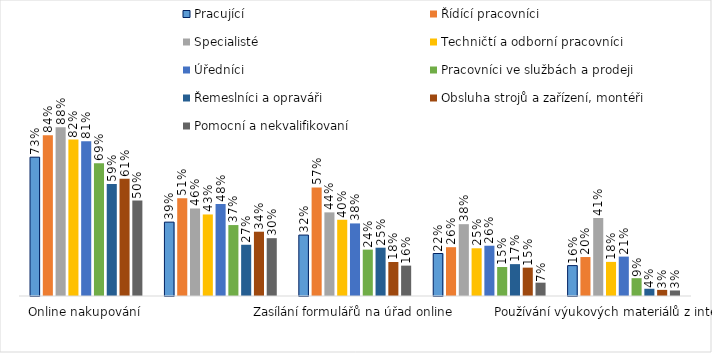
| Category | Pracující | Řídící pracovníci | Specialisté | Techničtí a odborní pracovníci | Úředníci | Pracovníci ve službách a prodeji | Řemeslníci a opraváři | Obsluha strojů a zařízení, montéři | Pomocní a nekvalifikovaní |
|---|---|---|---|---|---|---|---|---|---|
| Online nakupování | 0.727 | 0.842 | 0.884 | 0.819 | 0.81 | 0.694 | 0.587 | 0.614 | 0.5 |
| Objednání se k lékaři, na očkování či COVID testy | 0.387 | 0.512 | 0.458 | 0.427 | 0.481 | 0.371 | 0.268 | 0.337 | 0.303 |
| Zasílání formulářů na úřad online | 0.319 | 0.569 | 0.438 | 0.399 | 0.38 | 0.243 | 0.253 | 0.178 | 0.159 |
| Ověřování pravdivosti informací z internetu | 0.223 | 0.256 | 0.376 | 0.25 | 0.263 | 0.152 | 0.167 | 0.148 | 0.07 |
| Používání výukových materiálů z internetu | 0.159 | 0.204 | 0.408 | 0.179 | 0.206 | 0.093 | 0.038 | 0.032 | 0.029 |